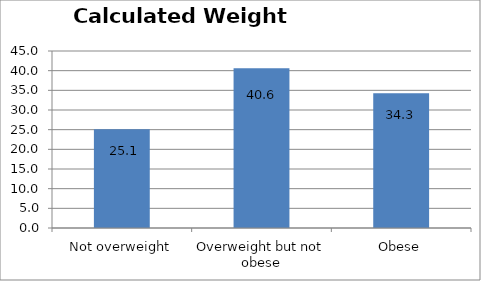
| Category | Series 0 |
|---|---|
| Not overweight | 25.097 |
| Overweight but not obese | 40.626 |
| Obese | 34.277 |